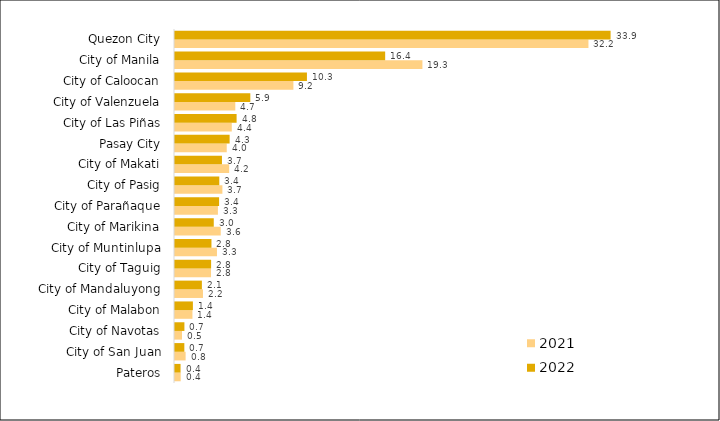
| Category | 2021 | 2022 |
|---|---|---|
|  Pateros | 0.444 | 0.432 |
|  City of San Juan | 0.826 | 0.727 |
|  City of Navotas | 0.544 | 0.732 |
|  City of Malabon | 1.358 | 1.393 |
|  City of Mandaluyong | 2.177 | 2.092 |
|  City of Taguig | 2.803 | 2.81 |
|  City of Muntinlupa | 3.266 | 2.837 |
|  City of Marikina | 3.559 | 3.017 |
|  City of Parañaque | 3.339 | 3.432 |
|  City of Pasig | 3.688 | 3.447 |
|  City of Makati | 4.215 | 3.654 |
|  Pasay City | 4.027 | 4.25 |
|  City of Las Piñas | 4.419 | 4.794 |
|  City of Valenzuela | 4.692 | 5.861 |
|  City of Caloocan | 9.214 | 10.267 |
|  City of Manila | 19.254 | 16.356 |
|  Quezon City | 32.176 | 33.898 |